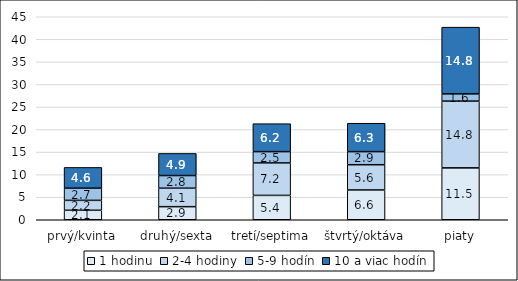
| Category | 1 hodinu | 2-4 hodiny | 5-9 hodín | 10 a viac hodín |
|---|---|---|---|---|
| prvý/kvinta | 2.1 | 2.2 | 2.7 | 4.6 |
| druhý/sexta | 2.9 | 4.1 | 2.8 | 4.9 |
| tretí/septima | 5.4 | 7.2 | 2.5 | 6.2 |
| štvrtý/oktáva | 6.6 | 5.6 | 2.9 | 6.3 |
| piaty | 11.5 | 14.8 | 1.6 | 14.8 |